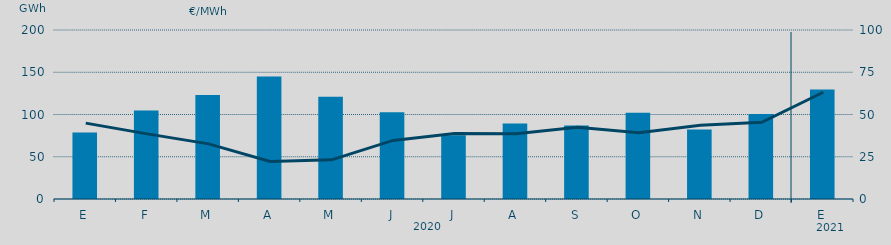
| Category | Energía a subir |
|---|---|
| E | 78.585 |
| F | 104.665 |
| M | 123.158 |
| A | 144.862 |
| M | 120.894 |
| J | 102.756 |
| J | 75.579 |
| A | 89.481 |
| S | 86.928 |
| O | 102.214 |
| N | 82.319 |
| D | 100.586 |
| E | 129.563 |